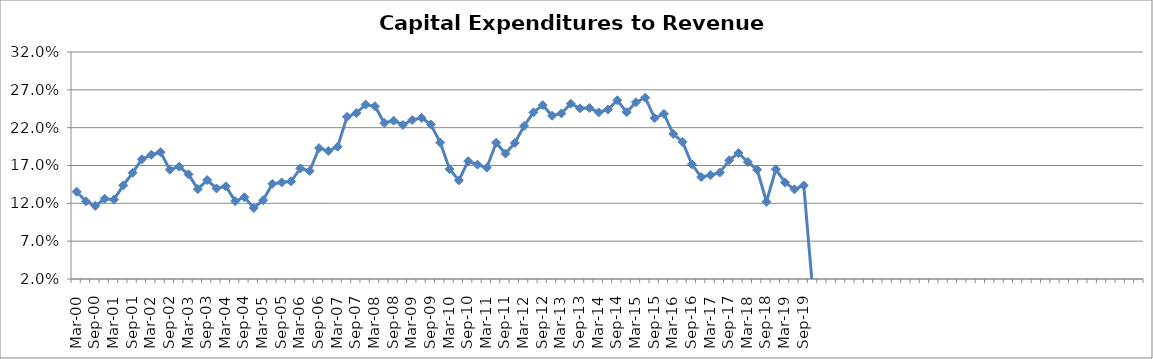
| Category | Series 0 |
|---|---|
| Mar-00 | 0.135 |
| Jun-00 | 0.123 |
| Sep-00 | 0.117 |
| Dec-00 | 0.126 |
| Mar-01 | 0.125 |
| Jun-01 | 0.144 |
| Sep-01 | 0.16 |
| Dec-01 | 0.178 |
| Mar-02 | 0.184 |
| Jun-02 | 0.188 |
| Sep-02 | 0.164 |
| Dec-02 | 0.168 |
| Mar-03 | 0.158 |
| Jun-03 | 0.139 |
| Sep-03 | 0.151 |
| Dec-03 | 0.14 |
| Mar-04 | 0.142 |
| Jun-04 | 0.123 |
| Sep-04 | 0.128 |
| Dec-04 | 0.114 |
| Mar-05 | 0.124 |
| Jun-05 | 0.146 |
| Sep-05 | 0.148 |
| Dec-05 | 0.149 |
| Mar-06 | 0.166 |
| Jun-06 | 0.163 |
| Sep-06 | 0.193 |
| Dec-06 | 0.189 |
| Mar-07 | 0.195 |
| Jun-07 | 0.234 |
| Sep-07 | 0.239 |
| Dec-07 | 0.25 |
| Mar-08 | 0.248 |
| Jun-08 | 0.226 |
| Sep-08 | 0.229 |
| Dec-08 | 0.224 |
| Mar-09 | 0.23 |
| Jun-09 | 0.233 |
| Sep-09 | 0.224 |
| Dec-09 | 0.2 |
| Mar-10 | 0.165 |
| Jun-10 | 0.15 |
| Sep-10 | 0.176 |
| Dec-10 | 0.171 |
| Mar-11 | 0.167 |
| Jun-11 | 0.2 |
| Sep-11 | 0.186 |
| Dec-11 | 0.2 |
| Mar-12 | 0.222 |
| Jun-12 | 0.24 |
| Sep-12 | 0.25 |
| Dec-12 | 0.236 |
| Mar-13 | 0.239 |
| Jun-13 | 0.252 |
| Sep-13 | 0.246 |
| Dec-13 | 0.246 |
| Mar-14 | 0.24 |
| Jun-14 | 0.244 |
| Sep-14 | 0.256 |
| Dec-14 | 0.24 |
| Mar-15 | 0.254 |
| Jun-15 | 0.26 |
| Sep-15 | 0.233 |
| Dec-15 | 0.238 |
| Mar-16 | 0.212 |
| Jun-16 | 0.201 |
| Sep-16 | 0.172 |
| Dec-16 | 0.155 |
| Mar-17 | 0.157 |
| Jun-17 | 0.161 |
| Sep-17 | 0.177 |
| Dec-17 | 0.186 |
| Mar-18 | 0.175 |
| Jun-18 | 0.164 |
| Sep-18 | 0.122 |
| Dec-18 | 0.165 |
| Mar-19 | 0.147 |
| Jun-19 | 0.138 |
| Sep-19 | 0.144 |